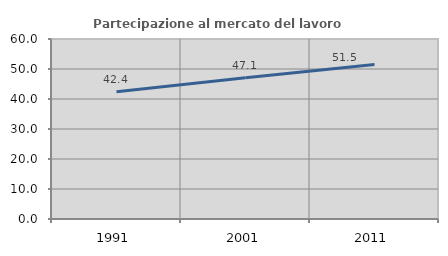
| Category | Partecipazione al mercato del lavoro  femminile |
|---|---|
| 1991.0 | 42.408 |
| 2001.0 | 47.079 |
| 2011.0 | 51.5 |